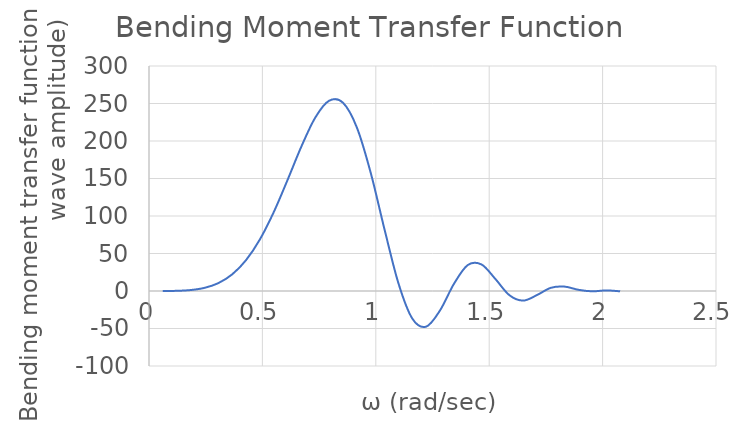
| Category | Series 0 |
|---|---|
| 0.0610934345293776 | 0.014 |
| 0.1221868690587552 | 0.234 |
| 0.1832803035881328 | 1.253 |
| 0.2443737381175104 | 4.148 |
| 0.305467172646888 | 10.474 |
| 0.3665606071762656 | 22.138 |
| 0.4276540417056432 | 41.071 |
| 0.4887474762350208 | 68.674 |
| 0.5498409107643984 | 105.035 |
| 0.6109343452937761 | 148.054 |
| 0.6720277798231538 | 192.754 |
| 0.7331212143525314 | 231.23 |
| 0.7942146488819091 | 253.708 |
| 0.8553080834112867 | 250.998 |
| 0.9164015179406644 | 218.078 |
| 0.977494952470042 | 157.669 |
| 1.0385883869994197 | 81.949 |
| 1.0996818215287973 | 10.428 |
| 1.160775256058175 | -36.668 |
| 1.2218686905875527 | -47.57 |
| 1.2829621251169303 | -26.002 |
| 1.344055559646308 | 9.303 |
| 1.4051489941756856 | 34.527 |
| 1.4662424287050633 | 35.347 |
| 1.527335863234441 | 15.99 |
| 1.5884292977638186 | -5.426 |
| 1.6495227322931962 | -12.8 |
| 1.710616166822574 | -5.427 |
| 1.7717096013519515 | 4.237 |
| 1.8328030358813292 | 5.827 |
| 1.8938964704107069 | 1.556 |
| 1.9549899049400845 | -0.437 |
| 2.016083339469462 | 0.795 |
| 2.0771767739988385 | -0.436 |